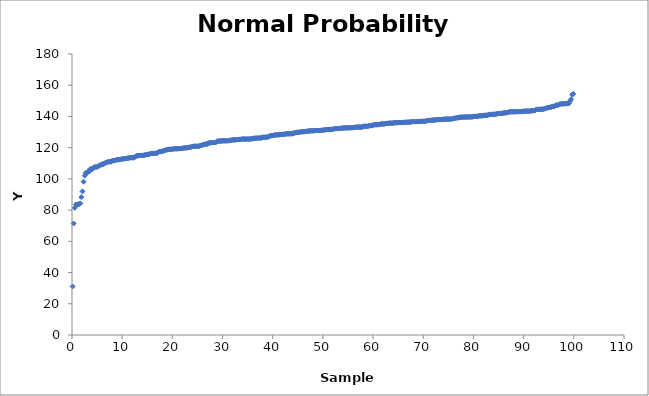
| Category | Series 0 |
|---|---|
| 0.10989010989010989 | 31.1 |
| 0.32967032967032966 | 71.4 |
| 0.5494505494505495 | 81.4 |
| 0.7692307692307692 | 83.6 |
| 0.989010989010989 | 83.6 |
| 1.208791208791209 | 83.8 |
| 1.4285714285714286 | 83.8 |
| 1.6483516483516483 | 84.3 |
| 1.8681318681318682 | 88.3 |
| 2.087912087912088 | 92 |
| 2.307692307692308 | 98.2 |
| 2.5274725274725274 | 102.1 |
| 2.7472527472527473 | 103.9 |
| 2.967032967032967 | 103.9 |
| 3.1868131868131866 | 104.6 |
| 3.4065934065934065 | 104.6 |
| 3.6263736263736264 | 106.3 |
| 3.8461538461538463 | 106.3 |
| 4.065934065934066 | 106.3 |
| 4.285714285714286 | 107.2 |
| 4.5054945054945055 | 107.6 |
| 4.7252747252747245 | 107.6 |
| 4.945054945054944 | 107.6 |
| 5.164835164835164 | 108 |
| 5.384615384615384 | 108.3 |
| 5.604395604395604 | 108.8 |
| 5.824175824175824 | 109.1 |
| 6.043956043956044 | 109.5 |
| 6.263736263736263 | 109.5 |
| 6.483516483516483 | 109.8 |
| 6.703296703296703 | 110.5 |
| 6.9230769230769225 | 110.6 |
| 7.142857142857142 | 110.9 |
| 7.362637362637362 | 110.9 |
| 7.582417582417582 | 111 |
| 7.802197802197802 | 111 |
| 8.021978021978022 | 111.7 |
| 8.241758241758241 | 111.7 |
| 8.461538461538462 | 111.8 |
| 8.68131868131868 | 111.9 |
| 8.901098901098901 | 112.3 |
| 9.12087912087912 | 112.3 |
| 9.34065934065934 | 112.3 |
| 9.56043956043956 | 112.5 |
| 9.78021978021978 | 112.6 |
| 10.0 | 112.7 |
| 10.219780219780219 | 112.9 |
| 10.43956043956044 | 112.9 |
| 10.659340659340659 | 113.1 |
| 10.879120879120878 | 113.1 |
| 11.098901098901099 | 113.3 |
| 11.318681318681318 | 113.3 |
| 11.538461538461538 | 113.6 |
| 11.758241758241757 | 113.6 |
| 11.978021978021978 | 113.6 |
| 12.197802197802197 | 113.6 |
| 12.417582417582416 | 113.6 |
| 12.637362637362637 | 114.4 |
| 12.857142857142856 | 114.8 |
| 13.076923076923077 | 114.8 |
| 13.296703296703296 | 115 |
| 13.516483516483516 | 115 |
| 13.736263736263735 | 115 |
| 13.956043956043956 | 115 |
| 14.175824175824175 | 115 |
| 14.395604395604394 | 115.3 |
| 14.615384615384615 | 115.3 |
| 14.835164835164834 | 115.6 |
| 15.054945054945055 | 115.7 |
| 15.274725274725274 | 115.7 |
| 15.494505494505495 | 115.9 |
| 15.714285714285714 | 116.3 |
| 15.934065934065934 | 116.3 |
| 16.153846153846153 | 116.3 |
| 16.373626373626372 | 116.3 |
| 16.59340659340659 | 116.3 |
| 16.813186813186814 | 116.6 |
| 17.032967032967033 | 116.6 |
| 17.252747252747252 | 117.2 |
| 17.47252747252747 | 117.5 |
| 17.692307692307693 | 117.5 |
| 17.912087912087912 | 117.7 |
| 18.13186813186813 | 117.7 |
| 18.35164835164835 | 118.2 |
| 18.57142857142857 | 118.2 |
| 18.791208791208792 | 118.7 |
| 19.01098901098901 | 118.7 |
| 19.23076923076923 | 118.9 |
| 19.45054945054945 | 118.9 |
| 19.670329670329668 | 118.9 |
| 19.89010989010989 | 119 |
| 20.10989010989011 | 119.2 |
| 20.32967032967033 | 119.2 |
| 20.549450549450547 | 119.3 |
| 20.76923076923077 | 119.3 |
| 20.98901098901099 | 119.3 |
| 21.208791208791208 | 119.4 |
| 21.428571428571427 | 119.4 |
| 21.648351648351646 | 119.4 |
| 21.86813186813187 | 119.5 |
| 22.087912087912088 | 119.6 |
| 22.307692307692307 | 119.8 |
| 22.527472527472526 | 119.9 |
| 22.747252747252748 | 119.9 |
| 22.967032967032967 | 119.9 |
| 23.186813186813186 | 120.1 |
| 23.406593406593405 | 120.3 |
| 23.626373626373624 | 120.3 |
| 23.846153846153847 | 120.6 |
| 24.065934065934066 | 120.8 |
| 24.285714285714285 | 120.8 |
| 24.505494505494504 | 120.9 |
| 24.725274725274723 | 120.9 |
| 24.945054945054945 | 120.9 |
| 25.164835164835164 | 120.9 |
| 25.384615384615383 | 121.1 |
| 25.604395604395602 | 121.3 |
| 25.824175824175825 | 121.6 |
| 26.043956043956044 | 121.7 |
| 26.263736263736263 | 122.1 |
| 26.483516483516482 | 122.1 |
| 26.7032967032967 | 122.3 |
| 26.923076923076923 | 122.3 |
| 27.142857142857142 | 122.9 |
| 27.36263736263736 | 123 |
| 27.58241758241758 | 123.1 |
| 27.802197802197803 | 123.3 |
| 28.021978021978022 | 123.3 |
| 28.24175824175824 | 123.3 |
| 28.46153846153846 | 123.3 |
| 28.68131868131868 | 123.4 |
| 28.9010989010989 | 124.1 |
| 29.12087912087912 | 124.2 |
| 29.34065934065934 | 124.2 |
| 29.56043956043956 | 124.3 |
| 29.78021978021978 | 124.3 |
| 30.0 | 124.4 |
| 30.21978021978022 | 124.4 |
| 30.439560439560438 | 124.4 |
| 30.659340659340657 | 124.4 |
| 30.87912087912088 | 124.4 |
| 31.0989010989011 | 124.5 |
| 31.318681318681318 | 124.5 |
| 31.538461538461537 | 124.8 |
| 31.75824175824176 | 124.8 |
| 31.978021978021978 | 125 |
| 32.1978021978022 | 125 |
| 32.417582417582416 | 125 |
| 32.637362637362635 | 125 |
| 32.857142857142854 | 125.2 |
| 33.07692307692307 | 125.2 |
| 33.2967032967033 | 125.3 |
| 33.51648351648352 | 125.3 |
| 33.73626373626374 | 125.4 |
| 33.956043956043956 | 125.5 |
| 34.175824175824175 | 125.5 |
| 34.395604395604394 | 125.5 |
| 34.61538461538461 | 125.5 |
| 34.83516483516483 | 125.5 |
| 35.05494505494505 | 125.5 |
| 35.27472527472528 | 125.5 |
| 35.494505494505496 | 125.5 |
| 35.714285714285715 | 125.7 |
| 35.934065934065934 | 125.7 |
| 36.15384615384615 | 126 |
| 36.37362637362637 | 126 |
| 36.59340659340659 | 126.1 |
| 36.81318681318681 | 126.1 |
| 37.03296703296703 | 126.1 |
| 37.25274725274725 | 126.2 |
| 37.472527472527474 | 126.2 |
| 37.69230769230769 | 126.2 |
| 37.91208791208791 | 126.6 |
| 38.13186813186813 | 126.7 |
| 38.35164835164835 | 126.7 |
| 38.57142857142857 | 126.7 |
| 38.79120879120879 | 126.7 |
| 39.01098901098901 | 126.9 |
| 39.230769230769226 | 127 |
| 39.45054945054945 | 127.6 |
| 39.67032967032967 | 127.6 |
| 39.89010989010989 | 127.8 |
| 40.10989010989011 | 127.8 |
| 40.32967032967033 | 128.1 |
| 40.54945054945055 | 128.1 |
| 40.76923076923077 | 128.2 |
| 40.989010989010985 | 128.2 |
| 41.208791208791204 | 128.3 |
| 41.42857142857143 | 128.3 |
| 41.64835164835165 | 128.5 |
| 41.86813186813187 | 128.5 |
| 42.08791208791209 | 128.5 |
| 42.30769230769231 | 128.6 |
| 42.527472527472526 | 128.8 |
| 42.747252747252745 | 128.8 |
| 42.967032967032964 | 128.9 |
| 43.18681318681318 | 128.9 |
| 43.40659340659341 | 128.9 |
| 43.62637362637363 | 128.9 |
| 43.84615384615385 | 128.9 |
| 44.065934065934066 | 129.3 |
| 44.285714285714285 | 129.3 |
| 44.505494505494504 | 129.6 |
| 44.72527472527472 | 129.8 |
| 44.94505494505494 | 129.8 |
| 45.16483516483516 | 129.8 |
| 45.38461538461539 | 130 |
| 45.604395604395606 | 130.1 |
| 45.824175824175825 | 130.2 |
| 46.043956043956044 | 130.2 |
| 46.26373626373626 | 130.2 |
| 46.48351648351648 | 130.4 |
| 46.7032967032967 | 130.5 |
| 46.92307692307692 | 130.5 |
| 47.14285714285714 | 130.7 |
| 47.362637362637365 | 130.7 |
| 47.582417582417584 | 130.8 |
| 47.8021978021978 | 130.8 |
| 48.02197802197802 | 130.8 |
| 48.24175824175824 | 130.8 |
| 48.46153846153846 | 131 |
| 48.68131868131868 | 131 |
| 48.9010989010989 | 131 |
| 49.12087912087912 | 131 |
| 49.340659340659336 | 131 |
| 49.56043956043956 | 131 |
| 49.78021978021978 | 131.2 |
| 50.0 | 131.2 |
| 50.21978021978022 | 131.3 |
| 50.43956043956044 | 131.4 |
| 50.65934065934066 | 131.6 |
| 50.879120879120876 | 131.6 |
| 51.098901098901095 | 131.7 |
| 51.318681318681314 | 131.7 |
| 51.53846153846154 | 131.7 |
| 51.75824175824176 | 131.7 |
| 51.97802197802198 | 131.8 |
| 52.1978021978022 | 132 |
| 52.417582417582416 | 132.2 |
| 52.637362637362635 | 132.2 |
| 52.857142857142854 | 132.2 |
| 53.07692307692307 | 132.3 |
| 53.29670329670329 | 132.3 |
| 53.51648351648352 | 132.4 |
| 53.73626373626374 | 132.4 |
| 53.956043956043956 | 132.6 |
| 54.175824175824175 | 132.6 |
| 54.395604395604394 | 132.7 |
| 54.61538461538461 | 132.7 |
| 54.83516483516483 | 132.7 |
| 55.05494505494505 | 132.7 |
| 55.27472527472527 | 132.7 |
| 55.494505494505496 | 132.8 |
| 55.714285714285715 | 132.8 |
| 55.934065934065934 | 132.8 |
| 56.15384615384615 | 132.9 |
| 56.37362637362637 | 133 |
| 56.59340659340659 | 133.2 |
| 56.81318681318681 | 133.2 |
| 57.03296703296703 | 133.2 |
| 57.25274725274725 | 133.2 |
| 57.472527472527474 | 133.2 |
| 57.69230769230769 | 133.2 |
| 57.91208791208791 | 133.3 |
| 58.13186813186813 | 133.7 |
| 58.35164835164835 | 133.7 |
| 58.57142857142857 | 133.7 |
| 58.79120879120879 | 133.7 |
| 59.01098901098901 | 133.7 |
| 59.230769230769226 | 134.1 |
| 59.45054945054945 | 134.1 |
| 59.67032967032967 | 134.1 |
| 59.89010989010989 | 134.3 |
| 60.10989010989011 | 134.6 |
| 60.32967032967033 | 134.7 |
| 60.54945054945055 | 134.7 |
| 60.76923076923077 | 134.7 |
| 60.989010989010985 | 134.8 |
| 61.208791208791204 | 134.8 |
| 61.42857142857143 | 135 |
| 61.64835164835165 | 135.2 |
| 61.86813186813187 | 135.2 |
| 62.08791208791209 | 135.2 |
| 62.30769230769231 | 135.2 |
| 62.527472527472526 | 135.5 |
| 62.747252747252745 | 135.5 |
| 62.967032967032964 | 135.6 |
| 63.18681318681318 | 135.7 |
| 63.40659340659341 | 135.7 |
| 63.62637362637363 | 135.7 |
| 63.84615384615385 | 135.7 |
| 64.06593406593407 | 135.9 |
| 64.28571428571429 | 135.9 |
| 64.50549450549451 | 136 |
| 64.72527472527473 | 136 |
| 64.94505494505495 | 136 |
| 65.16483516483517 | 136.1 |
| 65.38461538461539 | 136.1 |
| 65.6043956043956 | 136.1 |
| 65.82417582417582 | 136.1 |
| 66.04395604395604 | 136.2 |
| 66.26373626373626 | 136.2 |
| 66.4835164835165 | 136.3 |
| 66.70329670329672 | 136.3 |
| 66.92307692307693 | 136.3 |
| 67.14285714285715 | 136.4 |
| 67.36263736263737 | 136.4 |
| 67.58241758241759 | 136.5 |
| 67.80219780219781 | 136.7 |
| 68.02197802197803 | 136.7 |
| 68.24175824175825 | 136.7 |
| 68.46153846153847 | 136.7 |
| 68.68131868131869 | 136.7 |
| 68.9010989010989 | 136.7 |
| 69.12087912087912 | 136.8 |
| 69.34065934065934 | 136.8 |
| 69.56043956043956 | 136.8 |
| 69.78021978021978 | 136.9 |
| 70.0 | 136.9 |
| 70.21978021978022 | 136.9 |
| 70.43956043956045 | 136.9 |
| 70.65934065934067 | 137.2 |
| 70.87912087912089 | 137.4 |
| 71.09890109890111 | 137.4 |
| 71.31868131868133 | 137.5 |
| 71.53846153846155 | 137.5 |
| 71.75824175824177 | 137.6 |
| 71.97802197802199 | 137.7 |
| 72.1978021978022 | 137.7 |
| 72.41758241758242 | 137.7 |
| 72.63736263736264 | 137.9 |
| 72.85714285714286 | 138 |
| 73.07692307692308 | 138 |
| 73.2967032967033 | 138 |
| 73.51648351648352 | 138 |
| 73.73626373626374 | 138 |
| 73.95604395604396 | 138.2 |
| 74.17582417582418 | 138.2 |
| 74.3956043956044 | 138.3 |
| 74.61538461538463 | 138.3 |
| 74.83516483516485 | 138.3 |
| 75.05494505494507 | 138.3 |
| 75.27472527472528 | 138.3 |
| 75.4945054945055 | 138.3 |
| 75.71428571428572 | 138.4 |
| 75.93406593406594 | 138.6 |
| 76.15384615384616 | 138.8 |
| 76.37362637362638 | 138.9 |
| 76.5934065934066 | 139 |
| 76.81318681318682 | 139.2 |
| 77.03296703296704 | 139.2 |
| 77.25274725274726 | 139.5 |
| 77.47252747252747 | 139.5 |
| 77.6923076923077 | 139.5 |
| 77.91208791208791 | 139.5 |
| 78.13186813186813 | 139.6 |
| 78.35164835164835 | 139.6 |
| 78.57142857142858 | 139.6 |
| 78.7912087912088 | 139.6 |
| 79.01098901098902 | 139.7 |
| 79.23076923076924 | 139.7 |
| 79.45054945054946 | 139.7 |
| 79.67032967032968 | 139.7 |
| 79.8901098901099 | 139.8 |
| 80.10989010989012 | 140 |
| 80.32967032967034 | 140 |
| 80.54945054945055 | 140.1 |
| 80.76923076923077 | 140.1 |
| 80.98901098901099 | 140.2 |
| 81.20879120879121 | 140.4 |
| 81.42857142857143 | 140.4 |
| 81.64835164835165 | 140.4 |
| 81.86813186813187 | 140.5 |
| 82.08791208791209 | 140.7 |
| 82.3076923076923 | 140.7 |
| 82.52747252747254 | 140.7 |
| 82.74725274725276 | 140.8 |
| 82.96703296703298 | 141 |
| 83.1868131868132 | 141.3 |
| 83.40659340659342 | 141.3 |
| 83.62637362637363 | 141.3 |
| 83.84615384615385 | 141.3 |
| 84.06593406593407 | 141.4 |
| 84.28571428571429 | 141.4 |
| 84.50549450549451 | 141.5 |
| 84.72527472527473 | 141.7 |
| 84.94505494505495 | 141.9 |
| 85.16483516483517 | 141.9 |
| 85.38461538461539 | 141.9 |
| 85.6043956043956 | 142 |
| 85.82417582417582 | 142 |
| 86.04395604395604 | 142.3 |
| 86.26373626373626 | 142.3 |
| 86.48351648351648 | 142.3 |
| 86.70329670329672 | 142.5 |
| 86.92307692307693 | 142.5 |
| 87.14285714285715 | 143 |
| 87.36263736263737 | 143 |
| 87.58241758241759 | 143 |
| 87.80219780219781 | 143 |
| 88.02197802197803 | 143 |
| 88.24175824175825 | 143 |
| 88.46153846153847 | 143 |
| 88.68131868131869 | 143.1 |
| 88.9010989010989 | 143.1 |
| 89.12087912087912 | 143.1 |
| 89.34065934065934 | 143.1 |
| 89.56043956043956 | 143.1 |
| 89.78021978021978 | 143.2 |
| 90.0 | 143.3 |
| 90.21978021978022 | 143.4 |
| 90.43956043956044 | 143.4 |
| 90.65934065934067 | 143.4 |
| 90.87912087912089 | 143.4 |
| 91.09890109890111 | 143.4 |
| 91.31868131868133 | 143.5 |
| 91.53846153846155 | 143.6 |
| 91.75824175824177 | 143.7 |
| 91.97802197802199 | 143.7 |
| 92.1978021978022 | 143.7 |
| 92.41758241758242 | 144.3 |
| 92.63736263736264 | 144.5 |
| 92.85714285714286 | 144.5 |
| 93.07692307692308 | 144.5 |
| 93.2967032967033 | 144.5 |
| 93.51648351648352 | 144.6 |
| 93.73626373626374 | 144.6 |
| 93.95604395604396 | 144.7 |
| 94.17582417582418 | 144.9 |
| 94.3956043956044 | 145.1 |
| 94.61538461538463 | 145.4 |
| 94.83516483516485 | 145.7 |
| 95.05494505494507 | 145.7 |
| 95.27472527472528 | 145.9 |
| 95.4945054945055 | 146 |
| 95.71428571428572 | 146.4 |
| 95.93406593406594 | 146.4 |
| 96.15384615384616 | 146.5 |
| 96.37362637362638 | 147.2 |
| 96.5934065934066 | 147.2 |
| 96.81318681318682 | 147.2 |
| 97.03296703296704 | 147.6 |
| 97.25274725274726 | 147.9 |
| 97.47252747252747 | 148 |
| 97.6923076923077 | 148.1 |
| 97.91208791208791 | 148.1 |
| 98.13186813186813 | 148.2 |
| 98.35164835164835 | 148.2 |
| 98.57142857142857 | 148.2 |
| 98.7912087912088 | 148.3 |
| 99.01098901098902 | 148.3 |
| 99.23076923076924 | 149.8 |
| 99.45054945054946 | 151 |
| 99.67032967032968 | 153.9 |
| 99.8901098901099 | 154.5 |